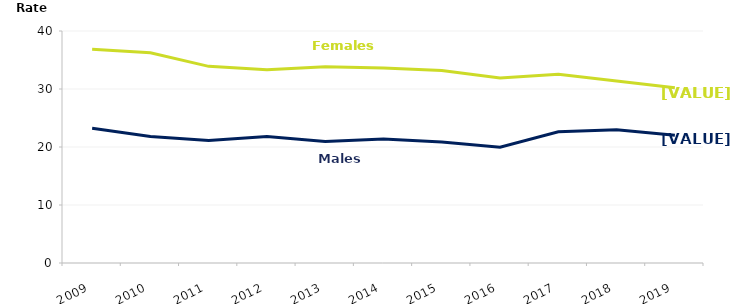
| Category | Male | Female |
|---|---|---|
| 2009.0 | 23.238 | 36.836 |
| 2010.0 | 21.81 | 36.238 |
| 2011.0 | 21.107 | 33.906 |
| 2012.0 | 21.804 | 33.303 |
| 2013.0 | 20.958 | 33.822 |
| 2014.0 | 21.36 | 33.604 |
| 2015.0 | 20.848 | 33.179 |
| 2016.0 | 19.951 | 31.917 |
| 2017.0 | 22.63 | 32.532 |
| 2018.0 | 22.986 | 31.398 |
| 2019.0 | 22.011 | 30.232 |